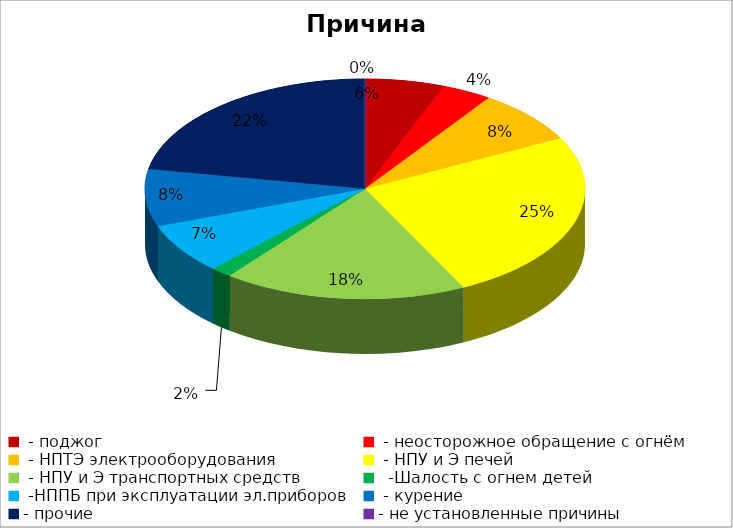
| Category | Причина пожара |
|---|---|
|  - поджог | 11 |
|  - неосторожное обращение с огнём | 7 |
|  - НПТЭ электрооборудования | 15 |
|  - НПУ и Э печей | 48 |
|  - НПУ и Э транспортных средств | 34 |
|   -Шалость с огнем детей | 3 |
|  -НППБ при эксплуатации эл.приборов | 14 |
|  - курение | 16 |
| - прочие | 42 |
| - не установленные причины | 0 |